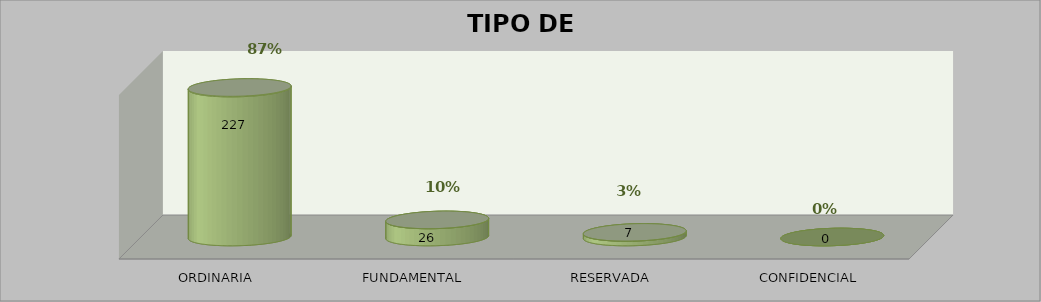
| Category | Series 0 | Series 2 | Series 3 | Series 1 |
|---|---|---|---|---|
| ORDINARIA |  | 227 | 0.873 |  |
| FUNDAMENTAL |  | 26 | 0.1 |  |
| RESERVADA |  | 7 | 0.027 |  |
| CONFIDENCIAL |  | 0 | 0 |  |